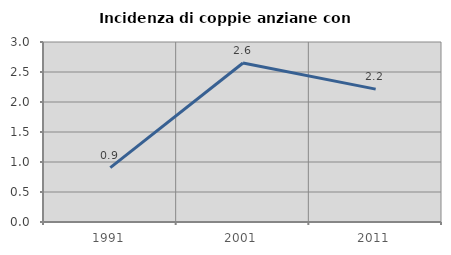
| Category | Incidenza di coppie anziane con figli |
|---|---|
| 1991.0 | 0.906 |
| 2001.0 | 2.649 |
| 2011.0 | 2.215 |